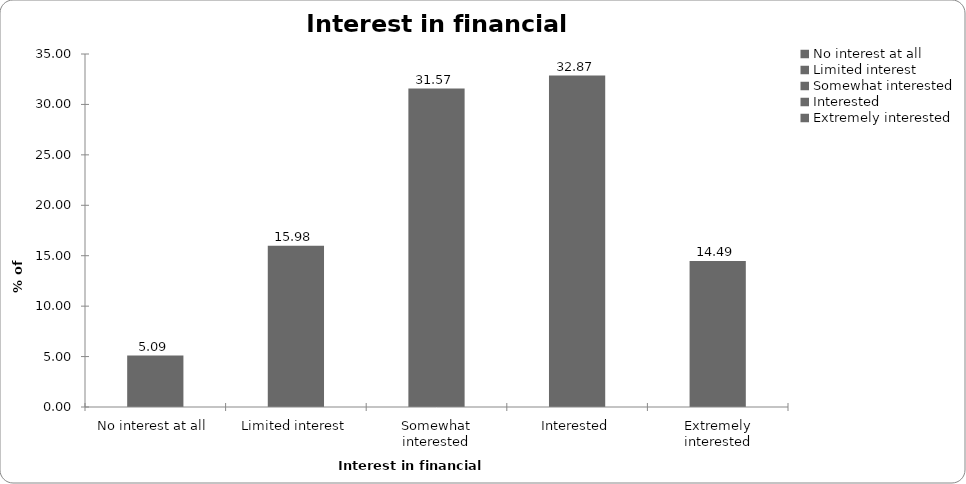
| Category | Interest in financial planning |
|---|---|
| No interest at all | 5.095 |
| Limited interest | 15.984 |
| Somewhat interested | 31.568 |
| Interested | 32.867 |
| Extremely interested | 14.486 |